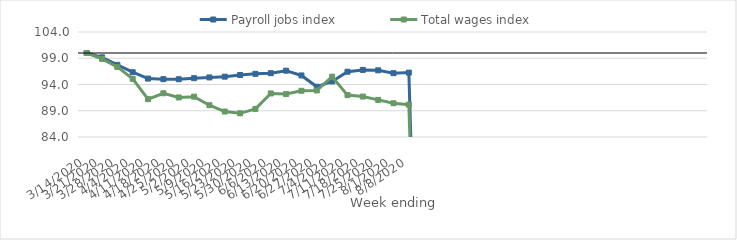
| Category | Payroll jobs index | Total wages index |
|---|---|---|
| 14/03/2020 | 100 | 100 |
| 21/03/2020 | 99.17 | 98.877 |
| 28/03/2020 | 97.74 | 97.347 |
| 04/04/2020 | 96.338 | 95.063 |
| 11/04/2020 | 95.126 | 91.217 |
| 18/04/2020 | 95.017 | 92.33 |
| 25/04/2020 | 95 | 91.532 |
| 02/05/2020 | 95.206 | 91.686 |
| 09/05/2020 | 95.348 | 90.054 |
| 16/05/2020 | 95.493 | 88.854 |
| 23/05/2020 | 95.805 | 88.506 |
| 30/05/2020 | 96.034 | 89.349 |
| 06/06/2020 | 96.156 | 92.298 |
| 13/06/2020 | 96.631 | 92.175 |
| 20/06/2020 | 95.724 | 92.802 |
| 27/06/2020 | 93.576 | 92.867 |
| 04/07/2020 | 94.577 | 95.491 |
| 11/07/2020 | 96.437 | 91.979 |
| 18/07/2020 | 96.781 | 91.706 |
| 25/07/2020 | 96.704 | 91.066 |
| 01/08/2020 | 96.154 | 90.429 |
| 08/08/2020 | 96.263 | 90.164 |